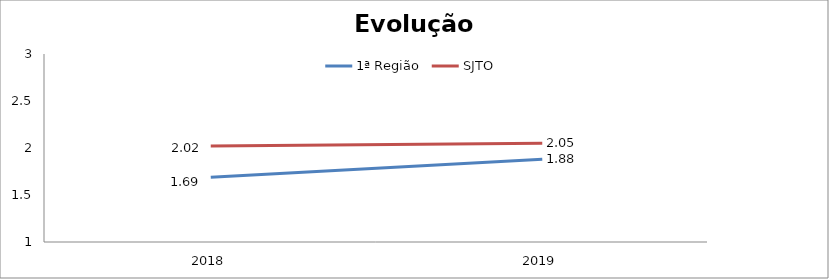
| Category | 1ª Região | SJTO |
|---|---|---|
| 2018.0 | 1.69 | 2.02 |
| 2019.0 | 1.88 | 2.05 |